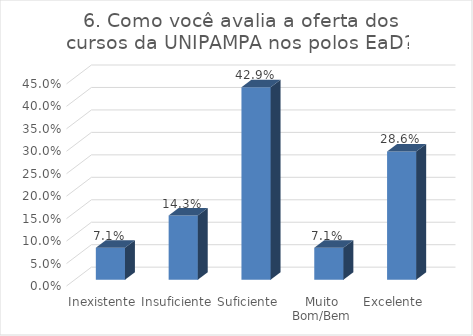
| Category | 6. Como você avalia a oferta dos cursos da UNIPAMPA nos polos EaD? |
|---|---|
| Inexistente | 0.071 |
| Insuficiente | 0.143 |
| Suficiente | 0.429 |
| Muito Bom/Bem | 0.071 |
| Excelente | 0.286 |